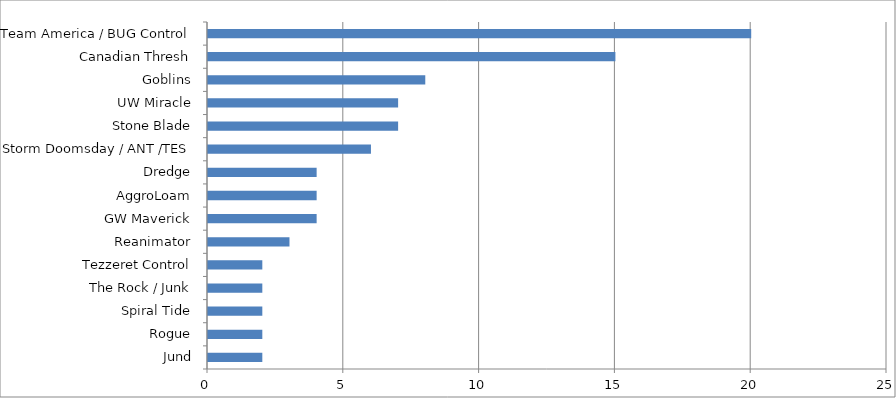
| Category | Series 0 |
|---|---|
| Jund | 2 |
| Rogue | 2 |
| Spiral Tide | 2 |
| The Rock / Junk | 2 |
| Tezzeret Control | 2 |
| Reanimator | 3 |
| GW Maverick | 4 |
| AggroLoam | 4 |
| Dredge | 4 |
| Storm Doomsday / ANT /TES | 6 |
| Stone Blade | 7 |
| UW Miracle | 7 |
| Goblins | 8 |
| Canadian Thresh | 15 |
| Team America / BUG Control | 20 |